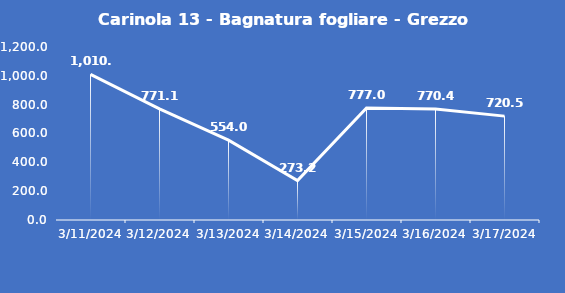
| Category | Carinola 13 - Bagnatura fogliare - Grezzo (min) |
|---|---|
| 3/11/24 | 1010.7 |
| 3/12/24 | 771.1 |
| 3/13/24 | 554 |
| 3/14/24 | 273.2 |
| 3/15/24 | 777 |
| 3/16/24 | 770.4 |
| 3/17/24 | 720.5 |